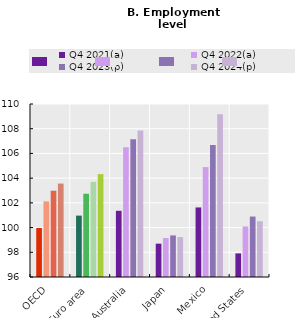
| Category | Q4 2021(a) | Q4 2022(a) | Q4 2023(p) | Q4 2024(p) |
|---|---|---|---|---|
| OECD | 99.965 | 102.117 | 102.983 | 103.561 |
| Euro area | 100.967 | 102.738 | 103.701 | 104.326 |
| Australia | 101.358 | 106.505 | 107.154 | 107.852 |
| Japan | 98.698 | 99.15 | 99.365 | 99.229 |
| Mexico | 101.629 | 104.896 | 106.69 | 109.165 |
| United States | 97.912 | 100.087 | 100.89 | 100.512 |